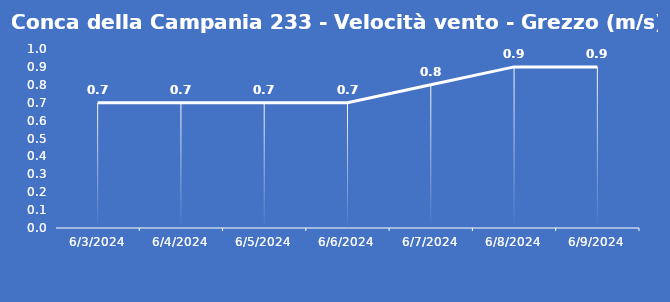
| Category | Conca della Campania 233 - Velocità vento - Grezzo (m/s) |
|---|---|
| 6/3/24 | 0.7 |
| 6/4/24 | 0.7 |
| 6/5/24 | 0.7 |
| 6/6/24 | 0.7 |
| 6/7/24 | 0.8 |
| 6/8/24 | 0.9 |
| 6/9/24 | 0.9 |